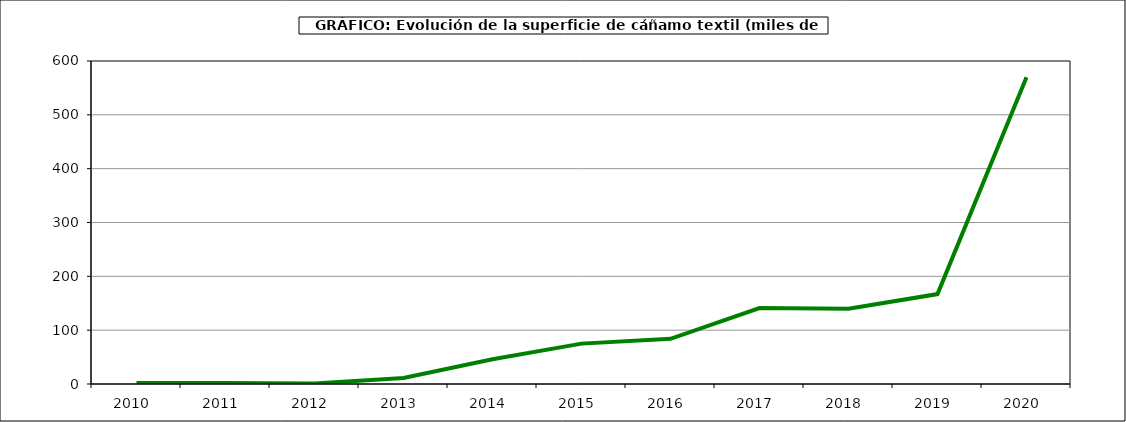
| Category | Superficie |
|---|---|
| 2010.0 | 2 |
| 2011.0 | 2 |
| 2012.0 | 1 |
| 2013.0 | 11 |
| 2014.0 | 46 |
| 2015.0 | 75 |
| 2016.0 | 84 |
| 2017.0 | 141 |
| 2018.0 | 140 |
| 2019.0 | 167 |
| 2020.0 | 570 |